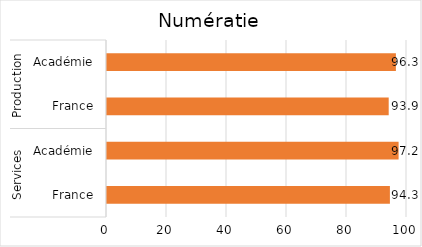
| Category | Series 0 |
|---|---|
| 0 | 94.3 |
| 1 | 97.2 |
| 2 | 93.9 |
| 3 | 96.3 |